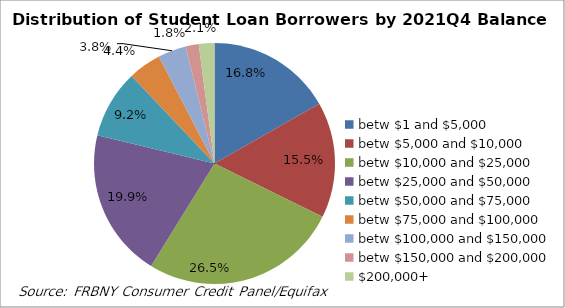
| Category | Series 0 |
|---|---|
| betw $1 and $5,000 | 0.168 |
| betw $5,000 and $10,000 | 0.155 |
| betw $10,000 and $25,000 | 0.265 |
| betw $25,000 and $50,000 | 0.199 |
| betw $50,000 and $75,000 | 0.092 |
| betw $75,000 and $100,000 | 0.044 |
| betw $100,000 and $150,000 | 0.038 |
| betw $150,000 and $200,000 | 0.018 |
| $200,000+ | 0.021 |